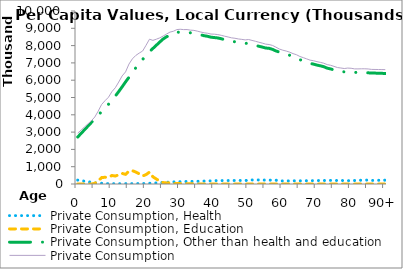
| Category | Private Consumption, Health | Private Consumption, Education | Private Consumption, Other than health and education | Private Consumption |
|---|---|---|---|---|
| 0 | 224271.037 | 0 | 2715015.584 | 2939286.621 |
|  | 193319.911 | 0 | 2925314.28 | 3118634.191 |
| 2 | 162368.786 | 0 | 3135612.976 | 3297981.761 |
| 3 | 131417.66 | 0 | 3345911.672 | 3477329.332 |
| 4 | 100466.534 | 0 | 3556210.368 | 3656676.902 |
| 5 | 67749.179 | 37391.172 | 3766509.064 | 3871649.414 |
| 6 | 53452.977 | 182827.088 | 3976807.76 | 4213087.825 |
| 7 | 41658.584 | 370923.16 | 4187106.456 | 4599688.2 |
| 8 | 30087.363 | 389205.331 | 4397405.152 | 4816697.846 |
| 9 | 18487.006 | 387395.373 | 4607703.848 | 5013586.227 |
| 10 | 17802.319 | 489855.202 | 4827690.524 | 5335348.045 |
| 11 | 18654.847 | 460806.732 | 5085023.362 | 5564484.941 |
| 12 | 18940.736 | 532289.934 | 5342788.104 | 5894018.773 |
| 13 | 19661.403 | 610563.481 | 5617054.214 | 6247279.099 |
| 14 | 19924.394 | 558225.189 | 5901389.707 | 6479539.29 |
| 15 | 20470.099 | 743839.049 | 6168717.479 | 6933026.626 |
| 16 | 22234.884 | 770115.096 | 6441245.675 | 7233595.655 |
| 17 | 23264.914 | 691724.603 | 6716536.876 | 7431526.394 |
| 18 | 24313.131 | 587746.82 | 6955346.28 | 7567406.231 |
| 19 | 25737.036 | 461458.181 | 7199819.804 | 7687015.022 |
| 20 | 26838.991 | 543359.177 | 7449489.74 | 8019687.909 |
| 21 | 40325.801 | 686288.452 | 7642343.55 | 8368957.802 |
| 22 | 50506.589 | 416371.2 | 7835437.192 | 8302314.98 |
| 23 | 62219.287 | 288134.852 | 8019460.963 | 8369815.102 |
| 24 | 74849.899 | 166888.948 | 8203961.781 | 8445700.628 |
| 25 | 87881.972 | 82183.978 | 8382227.72 | 8552293.671 |
| 26 | 98491.624 | 61189.131 | 8509711.182 | 8669391.936 |
| 27 | 111122.053 | 71368.713 | 8598063.965 | 8780554.731 |
| 28 | 121354.311 | 12065.187 | 8695721.387 | 8829140.885 |
| 29 | 132185.159 | 31459.08 | 8761895.816 | 8925540.055 |
| 30 | 134252.997 | 25661.296 | 8785031.136 | 8944945.429 |
| 31 | 144119.699 | 4730.262 | 8775584.878 | 8924434.84 |
| 32 | 146172.315 | 18249.742 | 8762116.09 | 8926538.147 |
| 33 | 148664.102 | 7164.642 | 8738130.085 | 8893958.829 |
| 34 | 150036.787 | 17172.143 | 8712537.652 | 8879746.583 |
| 35 | 155475.603 | 0 | 8680875.314 | 8836350.917 |
| 36 | 162357.313 | 0 | 8623232.503 | 8785589.815 |
| 37 | 168827.488 | 0 | 8570357.344 | 8739184.833 |
| 38 | 175549.993 | 0 | 8537485.394 | 8713035.386 |
| 39 | 181702.308 | 0 | 8485513.423 | 8667215.73 |
| 40 | 195913.763 | 0 | 8464014.196 | 8659927.96 |
| 41 | 194392.302 | 0 | 8441402.304 | 8635794.607 |
| 42 | 197770.274 | 0 | 8396322.097 | 8594092.371 |
| 43 | 201578.416 | 0 | 8341797.946 | 8543376.362 |
| 44 | 199894.675 | 0 | 8298237.238 | 8498131.912 |
| 45 | 200457.05 | 0 | 8248094.979 | 8448552.029 |
| 46 | 202786.938 | 0 | 8222040.834 | 8424827.772 |
| 47 | 205981.078 | 0 | 8179116.213 | 8385097.291 |
| 48 | 204993.94 | 0 | 8155427.252 | 8360421.192 |
| 49 | 194810.032 | 0 | 8134964.096 | 8329774.128 |
| 50 | 235005.856 | 0 | 8117373.657 | 8352379.512 |
| 51 | 233719.622 | 0 | 8065606.262 | 8299325.884 |
| 52 | 231945.949 | 0 | 8018315.952 | 8250261.901 |
| 53 | 234234.289 | 0 | 7961369.117 | 8195603.406 |
| 54 | 229074.07 | 0 | 7915772.461 | 8144846.53 |
| 55 | 225253.518 | 0 | 7859757.953 | 8085011.472 |
| 56 | 220302.906 | 0 | 7842504.157 | 8062807.064 |
| 57 | 227474.848 | 0 | 7782411.721 | 8009886.569 |
| 58 | 219758.178 | 0 | 7690424.104 | 7910182.281 |
| 59 | 178843.913 | 0 | 7623640.239 | 7802484.152 |
| 60 | 177738.992 | 0 | 7557211.231 | 7734950.223 |
| 61 | 178399.451 | 0 | 7507367.777 | 7685767.228 |
| 62 | 179456.679 | 0 | 7443953.664 | 7623410.343 |
| 63 | 185011.873 | 0 | 7351941.19 | 7536953.063 |
| 64 | 184704.251 | 0 | 7289022.94 | 7473727.191 |
| 65 | 185335.862 | 0 | 7187218.845 | 7372554.706 |
| 66 | 182426.437 | 0 | 7120713.304 | 7303139.74 |
| 67 | 190822.115 | 0 | 7041656.389 | 7232478.504 |
| 68 | 187921.832 | 0 | 6971297.677 | 7159219.509 |
| 69 | 197755.375 | 0 | 6928646.754 | 7126402.128 |
| 70 | 199833.779 | 0 | 6873575.146 | 7073408.925 |
| 71 | 200577.958 | 0 | 6831401.88 | 7031979.839 |
| 72 | 202603.311 | 0 | 6779864.623 | 6982467.934 |
| 73 | 206917.181 | 0 | 6695112.633 | 6902029.815 |
| 74 | 210150.533 | 0 | 6651856.994 | 6862007.526 |
| 75 | 208025.824 | 0 | 6591588.019 | 6799613.842 |
| 76 | 201980.324 | 0 | 6529769.765 | 6731750.089 |
| 77 | 208567.491 | 0 | 6495941.679 | 6704509.17 |
| 78 | 192054.993 | 0 | 6482576.089 | 6674631.082 |
| 79 | 189001.535 | 0 | 6512470.765 | 6701472.3 |
| 80 | 204120.291 | 0 | 6485568.367 | 6689688.658 |
| 81 | 200283.55 | 0 | 6453485.988 | 6653769.538 |
| 82 | 206538.219 | 0 | 6446322.166 | 6652860.386 |
| 83 | 219158.767 | 0 | 6439158.345 | 6658317.111 |
| 84 | 227712.156 | 0 | 6431994.524 | 6659706.68 |
| 85 | 225178.307 | 0 | 6424830.702 | 6650009.009 |
| 86 | 205957.117 | 0 | 6417666.88 | 6623623.997 |
| 87 | 209994.625 | 0 | 6410503.058 | 6620497.684 |
| 88 | 214032.133 | 0 | 6403339.238 | 6617371.37 |
| 89 | 218069.642 | 0 | 6396175.416 | 6614245.057 |
| 90+ | 222107.15 | 0 | 6389011.594 | 6611118.744 |